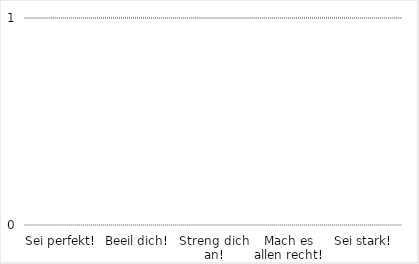
| Category | Series 0 |
|---|---|
| Sei perfekt! | 0 |
| Beeil dich! | 0 |
| Streng dich an! | 0 |
| Mach es allen recht! | 0 |
| Sei stark! | 0 |